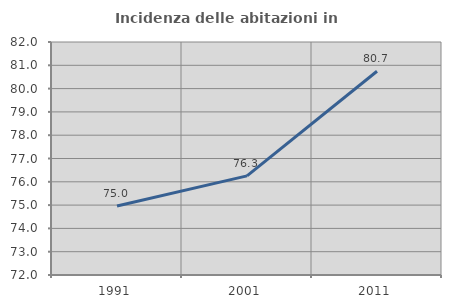
| Category | Incidenza delle abitazioni in proprietà  |
|---|---|
| 1991.0 | 74.96 |
| 2001.0 | 76.255 |
| 2011.0 | 80.743 |